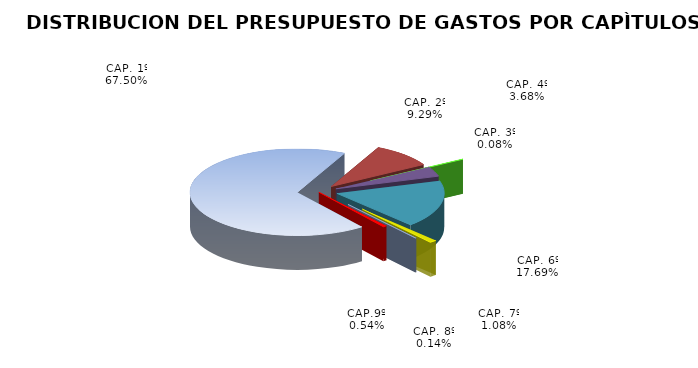
| Category | Series 1 | CAP. 1º CAP. 2º CAP. 3º CAP. 4º CAP. 6º CAP. 7º CAP. 8º CAP. 9º |
|---|---|---|
| CAP. 1º | 0.675 | 0.675 |
| CAP. 2º | 0.093 | 0.093 |
| CAP. 3º | 0.001 | 0.001 |
| CAP. 4º | 0.037 | 0.037 |
| CAP. 6º | 0.177 | 0.177 |
| CAP. 7º | 0.011 | 0.011 |
| CAP. 8º | 0.001 | 0.001 |
| CAP.9º | 0.005 | 0.005 |